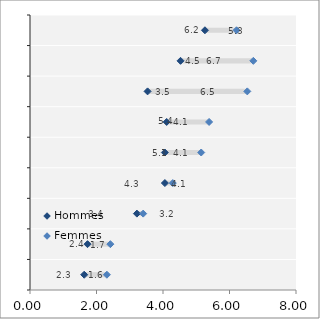
| Category | Hidden bar male | Difference |
|---|---|---|
| Lituanie | 1.63 | 0.682 |
| Lettonie | 1.73 | 0.687 |
| Israël | 3.214 | 0.19 |
| Danemark | 4.057 | 0.238 |
| Suède | 4.055 | 1.095 |
| Corée | 4.111 | 1.276 |
| Nouvelle-Zélande | 3.537 | 2.999 |
| Finlande | 4.527 | 2.189 |
| Norvège | 5.262 | 0.95 |